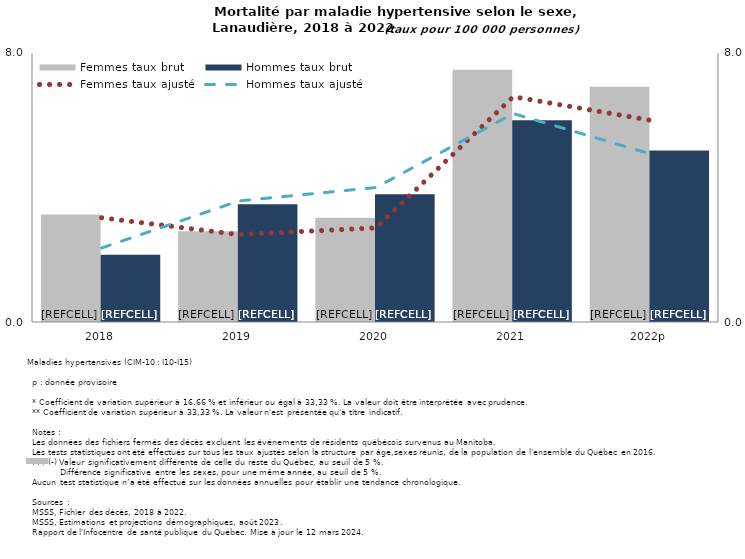
| Category | Femmes taux brut | Hommes taux brut |
|---|---|---|
| 2018 | 3.2 | 2 |
| 2019 | 2.7 | 3.5 |
| 2020 | 3.1 | 3.8 |
| 2021 | 7.5 | 6 |
| 2022p | 7 | 5.1 |